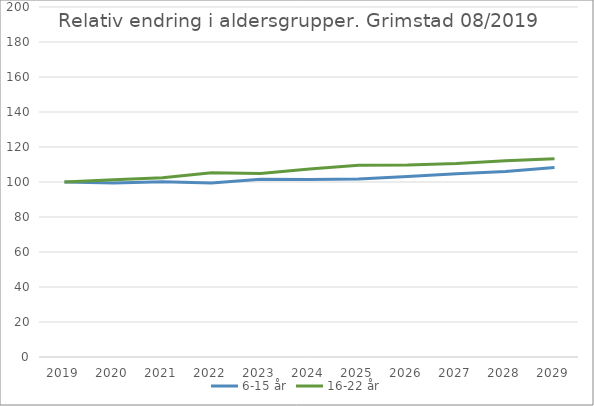
| Category | 6-15 år | 16-22 år |
|---|---|---|
| 2019 | 100 | 100 |
| 2020 | 99.409 | 101.27 |
| 2021 | 100.171 | 102.364 |
| 2022 | 99.368 | 105.33 |
| 2023 | 101.528 | 104.904 |
| 2024 | 101.449 | 107.414 |
| 2025 | 101.646 | 109.601 |
| 2026 | 103.185 | 109.666 |
| 2027 | 104.739 | 110.527 |
| 2028 | 106.019 | 112.126 |
| 2029 | 108.307 | 113.274 |